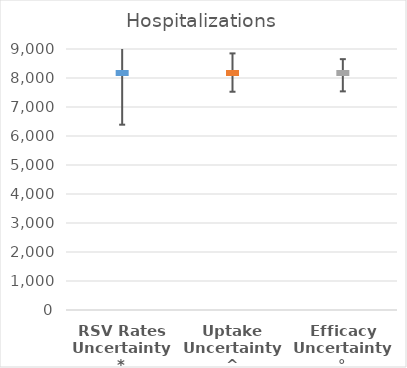
| Category | Series 0 |
|---|---|
| RSV Rates Uncertainty* | 8190 |
| Uptake Uncertainty^ | 8190 |
| Efficacy Uncertainty° | 8190 |